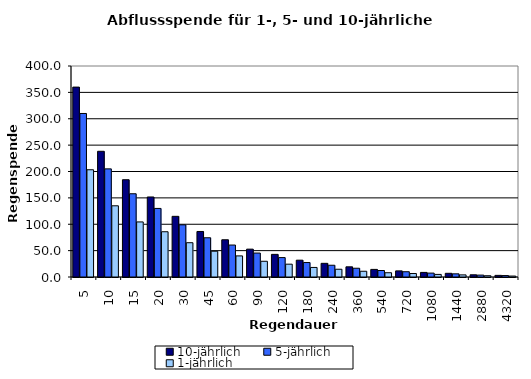
| Category | 10-jährlich | 5-jährlich | 1-jährlich |
|---|---|---|---|
| 5.0 | 360 | 310 | 203.3 |
| 10.0 | 238.3 | 205 | 135 |
| 15.0 | 184.4 | 157.8 | 104.4 |
| 20.0 | 151.7 | 130 | 85.8 |
| 30.0 | 115 | 98.9 | 65 |
| 45.0 | 86.3 | 74.4 | 48.9 |
| 60.0 | 70.6 | 60.6 | 40 |
| 90.0 | 52.8 | 45.4 | 29.8 |
| 120.0 | 42.9 | 36.8 | 24.3 |
| 180.0 | 31.9 | 27.4 | 18.1 |
| 240.0 | 25.9 | 22.3 | 14.7 |
| 360.0 | 19.3 | 16.6 | 10.9 |
| 540.0 | 14.4 | 12.3 | 8.1 |
| 720.0 | 11.6 | 10 | 6.6 |
| 1080.0 | 8.7 | 7.4 | 4.9 |
| 1440.0 | 7 | 6 | 4 |
| 2880.0 | 4.2 | 3.6 | 2.4 |
| 4320.0 | 3.1 | 2.7 | 1.8 |